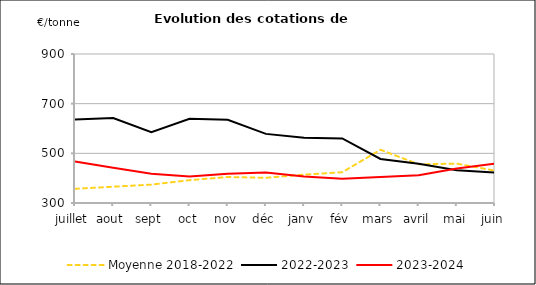
| Category | Moyenne 2018-2022 | 2022-2023 | 2023-2024 |
|---|---|---|---|
| juillet | 357.167 | 636.667 | 466.67 |
| aout | 365.6 | 642.5 | 441.67 |
| sept | 374.05 | 585 | 418.13 |
| oct | 392 | 639.375 | 406.25 |
| nov | 404.653 | 635 | 417.5 |
| déc | 401.5 | 578.333 | 422.5 |
| janv | 414.3 | 562.5 | 406.25 |
| fév | 423.9 | 560 | 398 |
| mars | 514.388 | 477.5 | 405 |
| avril | 455.9 | 458.125 | 411.88 |
| mai | 458.5 | 431.667 | 439.17 |
| juin | 430.25 | 423 | 459 |